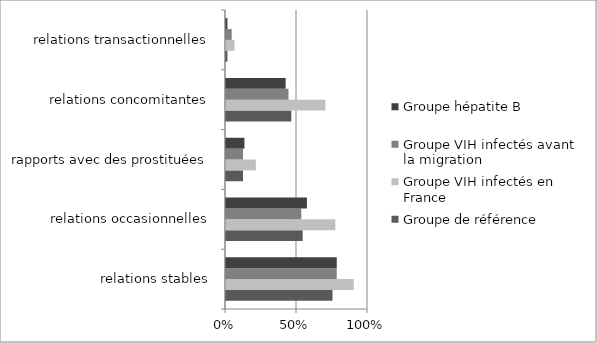
| Category | Groupe de référence | Groupe VIH infectés en France | Groupe VIH infectés avant la migration | Groupe hépatite B |
|---|---|---|---|---|
| relations stables | 0.75 | 0.9 | 0.78 | 0.78 |
| relations occasionnelles | 0.54 | 0.77 | 0.53 | 0.57 |
| rapports avec des prostituées | 0.12 | 0.21 | 0.12 | 0.13 |
| relations concomitantes | 0.46 | 0.7 | 0.44 | 0.42 |
| relations transactionnelles | 0.01 | 0.06 | 0.04 | 0.01 |